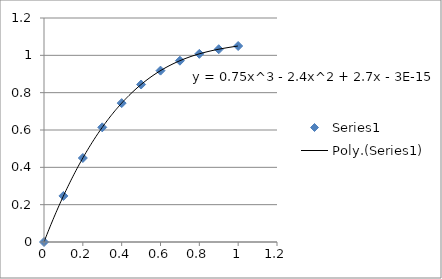
| Category | Series 0 |
|---|---|
| 0.0 | 0 |
| 0.1 | 0.247 |
| 0.2 | 0.45 |
| 0.3 | 0.614 |
| 0.4 | 0.744 |
| 0.5 | 0.844 |
| 0.6 | 0.918 |
| 0.7 | 0.971 |
| 0.8 | 1.008 |
| 0.9 | 1.033 |
| 1.0 | 1.05 |